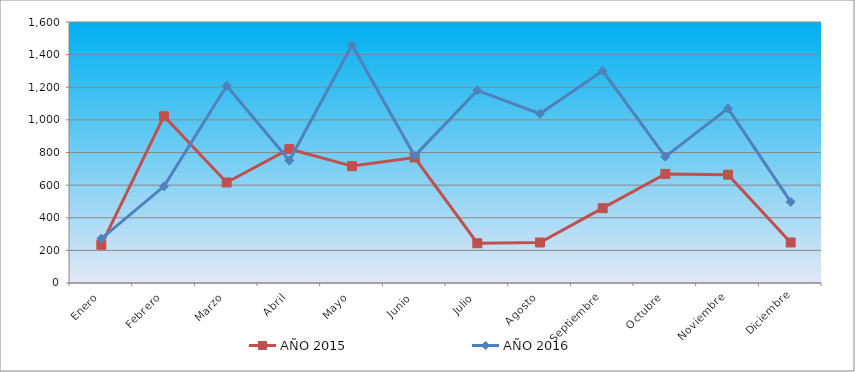
| Category | AÑO 2015 | AÑO 2016 |
|---|---|---|
| Enero | 234.117 | 272.501 |
| Febrero | 1022.471 | 592.808 |
| Marzo | 616.349 | 1209.52 |
| Abril | 821.799 | 750.572 |
| Mayo | 716.685 | 1458.117 |
| Junio | 769.242 | 779.256 |
| Julio | 243.673 | 1180.836 |
| Agosto | 248.451 | 1037.414 |
| Septiembre | 458.679 | 1300.354 |
| Octubre | 668.906 | 774.475 |
| Noviembre | 664.129 | 1070.879 |
| Diciembre | 248.451 | 497.194 |